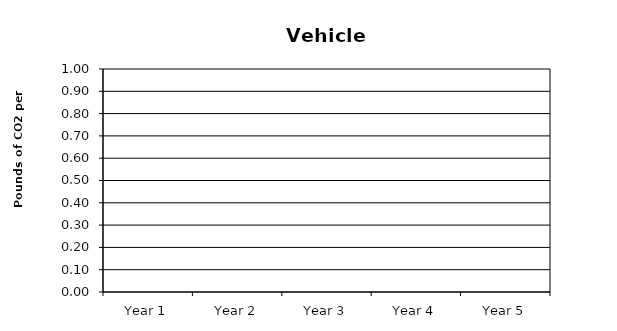
| Category | Series 0 |
|---|---|
| Year 1 | 0 |
| Year 2 | 0 |
| Year 3 | 0 |
| Year 4 | 0 |
| Year 5 | 0 |